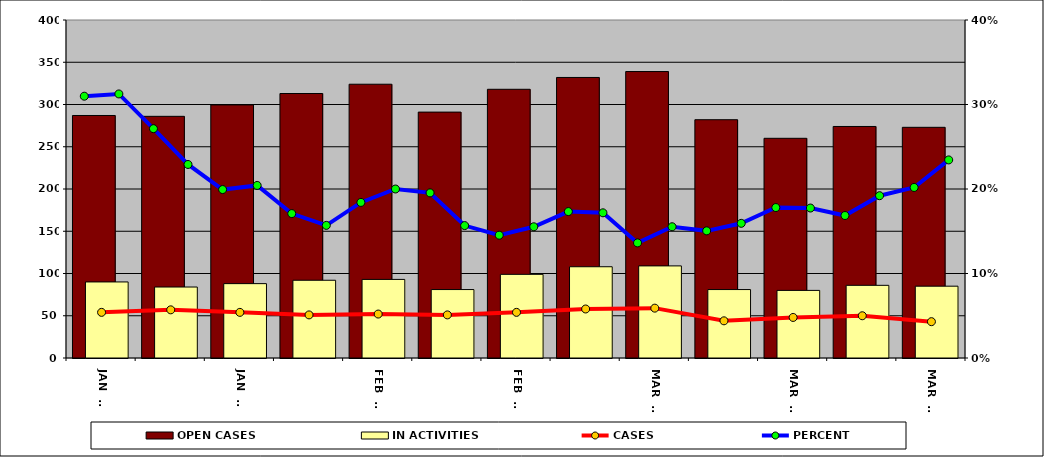
| Category | OPEN CASES | IN ACTIVITIES |
|---|---|---|
| JAN 02 | 287 | 90 |
| JAN 09 | 286 | 84 |
| JAN 16 | 299.5 | 88 |
| JAN 23 | 313 | 92 |
| JAN 30 | 324 | 93 |
| FEB 06 | 291 | 81 |
| FEB 13 | 318 | 99 |
| FEB 20 | 332 | 108 |
| FEB 27 | 339 | 109 |
| MAR 06 | 282 | 81 |
| MAR 13 | 260 | 80 |
| MAR 20 | 274 | 86 |
| MAR 27 | 273 | 85 |